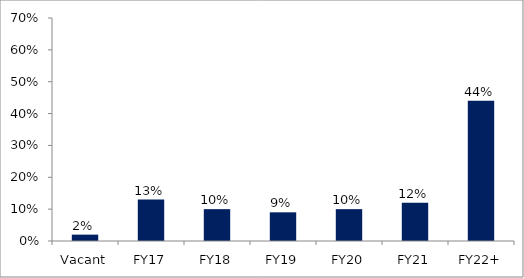
| Category | Series 0 |
|---|---|
| Vacant | 0.02 |
| FY17 | 0.13 |
| FY18 | 0.1 |
| FY19 | 0.09 |
| FY20 | 0.1 |
| FY21 | 0.12 |
| FY22+ | 0.44 |